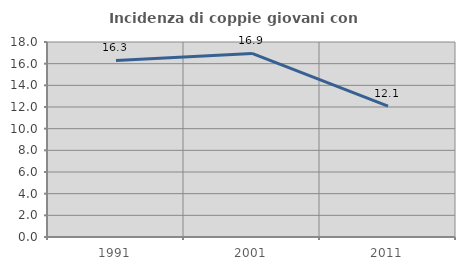
| Category | Incidenza di coppie giovani con figli |
|---|---|
| 1991.0 | 16.296 |
| 2001.0 | 16.942 |
| 2011.0 | 12.073 |